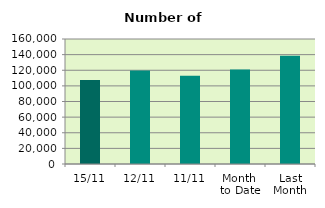
| Category | Series 0 |
|---|---|
| 15/11 | 107592 |
| 12/11 | 119714 |
| 11/11 | 113076 |
| Month 
to Date | 120848.364 |
| Last
Month | 138693.238 |